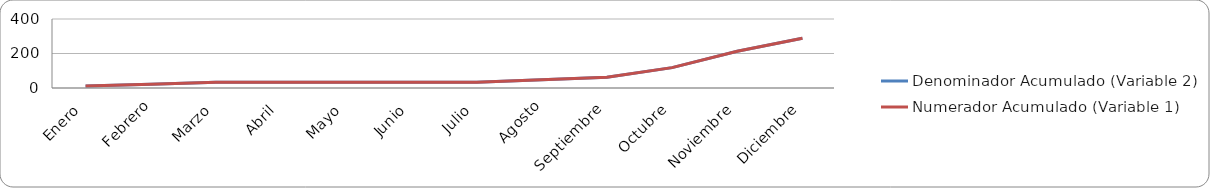
| Category | Denominador Acumulado (Variable 2) | Numerador Acumulado (Variable 1) |
|---|---|---|
| Enero  | 11 | 11 |
| Febrero | 22 | 22 |
| Marzo | 33 | 33 |
| Abril | 33 | 33 |
| Mayo | 33 | 33 |
| Junio | 33 | 33 |
| Julio | 33 | 33 |
| Agosto | 48 | 48 |
| Septiembre | 63 | 63 |
| Octubre | 118 | 118 |
| Noviembre | 213 | 213 |
| Diciembre | 288 | 288 |